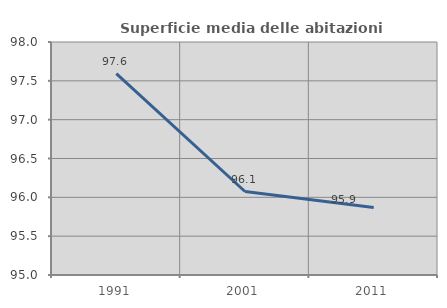
| Category | Superficie media delle abitazioni occupate |
|---|---|
| 1991.0 | 97.592 |
| 2001.0 | 96.075 |
| 2011.0 | 95.868 |